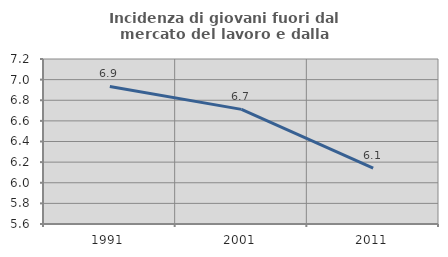
| Category | Incidenza di giovani fuori dal mercato del lavoro e dalla formazione  |
|---|---|
| 1991.0 | 6.934 |
| 2001.0 | 6.711 |
| 2011.0 | 6.141 |